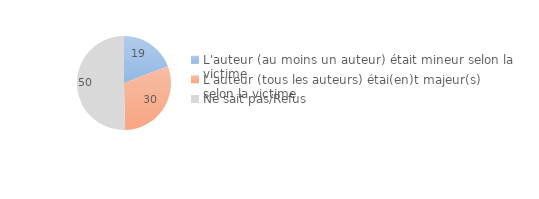
| Category | Series 0 |
|---|---|
| L'auteur (au moins un auteur) était mineur selon la victime | 19.198 |
| L'auteur (tous les auteurs) étai(en)t majeur(s) selon la victime | 30.409 |
| Ne sait pas/Refus | 50.393 |